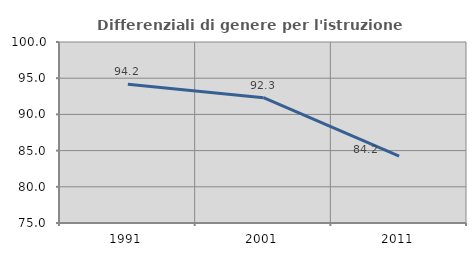
| Category | Differenziali di genere per l'istruzione superiore |
|---|---|
| 1991.0 | 94.181 |
| 2001.0 | 92.312 |
| 2011.0 | 84.234 |